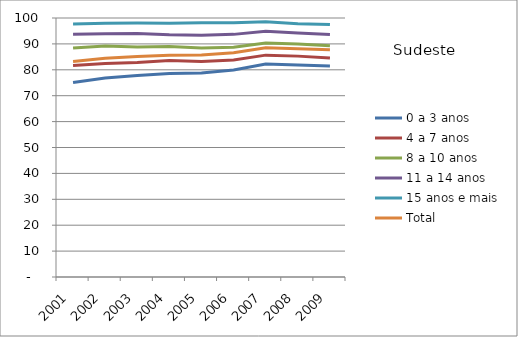
| Category | 0 a 3 anos | 4 a 7 anos | 8 a 10 anos | 11 a 14 anos | 15 anos e mais | Total |
|---|---|---|---|---|---|---|
| 2001.0 | 75.08 | 81.7 | 88.42 | 93.76 | 97.69 | 83.2 |
| 2002.0 | 76.87 | 82.4 | 89.2 | 93.94 | 97.94 | 84.44 |
| 2003.0 | 77.83 | 82.84 | 88.83 | 94.04 | 98.04 | 85.12 |
| 2004.0 | 78.59 | 83.57 | 89.03 | 93.49 | 97.98 | 85.65 |
| 2005.0 | 78.73 | 83.16 | 88.46 | 93.38 | 98.17 | 85.68 |
| 2006.0 | 79.94 | 83.81 | 88.75 | 93.68 | 98.18 | 86.59 |
| 2007.0 | 82.24 | 85.66 | 90.38 | 94.88 | 98.51 | 88.47 |
| 2008.0 | 81.86 | 85.28 | 89.93 | 94.2 | 97.82 | 88.12 |
| 2009.0 | 81.45 | 84.54 | 89.32 | 93.62 | 97.45 | 87.72 |